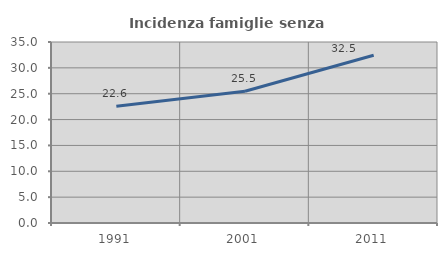
| Category | Incidenza famiglie senza nuclei |
|---|---|
| 1991.0 | 22.594 |
| 2001.0 | 25.468 |
| 2011.0 | 32.45 |